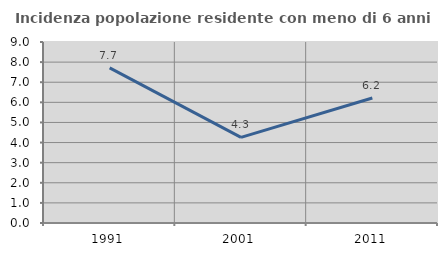
| Category | Incidenza popolazione residente con meno di 6 anni |
|---|---|
| 1991.0 | 7.712 |
| 2001.0 | 4.26 |
| 2011.0 | 6.214 |